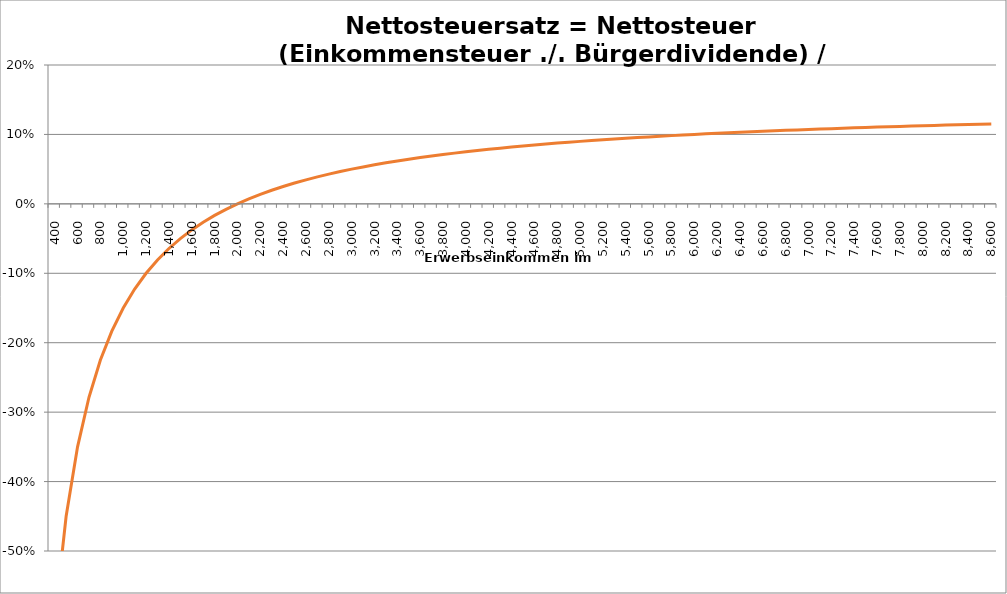
| Category | Nettosteuersatz |
|---|---|
| 400.0 | -0.6 |
| 500.0 | -0.45 |
| 600.0 | -0.35 |
| 700.0 | -0.279 |
| 800.0 | -0.225 |
| 900.0 | -0.183 |
| 1000.0 | -0.15 |
| 1100.0 | -0.123 |
| 1200.0 | -0.1 |
| 1300.0 | -0.081 |
| 1400.0 | -0.064 |
| 1500.0 | -0.05 |
| 1600.0 | -0.038 |
| 1700.0 | -0.026 |
| 1800.0 | -0.017 |
| 1900.0 | -0.008 |
| 2000.0 | 0 |
| 2100.0 | 0.007 |
| 2200.0 | 0.014 |
| 2300.0 | 0.02 |
| 2400.0 | 0.025 |
| 2500.0 | 0.03 |
| 2600.0 | 0.035 |
| 2700.0 | 0.039 |
| 2800.0 | 0.043 |
| 2900.0 | 0.047 |
| 3000.0 | 0.05 |
| 3100.0 | 0.053 |
| 3200.0 | 0.056 |
| 3300.0 | 0.059 |
| 3400.0 | 0.062 |
| 3500.0 | 0.064 |
| 3600.0 | 0.067 |
| 3700.0 | 0.069 |
| 3800.0 | 0.071 |
| 3900.0 | 0.073 |
| 4000.0 | 0.075 |
| 4100.0 | 0.077 |
| 4200.0 | 0.079 |
| 4300.0 | 0.08 |
| 4400.0 | 0.082 |
| 4500.0 | 0.083 |
| 4600.0 | 0.085 |
| 4700.0 | 0.086 |
| 4800.0 | 0.088 |
| 4900.0 | 0.089 |
| 5000.0 | 0.09 |
| 5100.0 | 0.091 |
| 5200.0 | 0.092 |
| 5300.0 | 0.093 |
| 5400.0 | 0.094 |
| 5500.0 | 0.095 |
| 5600.0 | 0.096 |
| 5700.0 | 0.097 |
| 5800.0 | 0.098 |
| 5900.0 | 0.099 |
| 6000.0 | 0.1 |
| 6100.0 | 0.101 |
| 6200.0 | 0.102 |
| 6300.0 | 0.102 |
| 6400.0 | 0.103 |
| 6500.0 | 0.104 |
| 6600.0 | 0.105 |
| 6700.0 | 0.105 |
| 6800.0 | 0.106 |
| 6900.0 | 0.107 |
| 7000.0 | 0.107 |
| 7100.0 | 0.108 |
| 7200.0 | 0.108 |
| 7300.0 | 0.109 |
| 7400.0 | 0.109 |
| 7500.0 | 0.11 |
| 7600.0 | 0.111 |
| 7700.0 | 0.111 |
| 7800.0 | 0.112 |
| 7900.0 | 0.112 |
| 8000.0 | 0.112 |
| 8100.0 | 0.113 |
| 8200.0 | 0.113 |
| 8300.0 | 0.114 |
| 8400.0 | 0.114 |
| 8500.0 | 0.115 |
| 8600.0 | 0.115 |